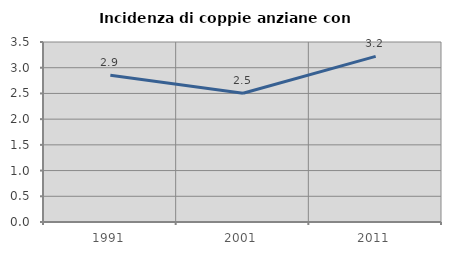
| Category | Incidenza di coppie anziane con figli |
|---|---|
| 1991.0 | 2.851 |
| 2001.0 | 2.505 |
| 2011.0 | 3.22 |